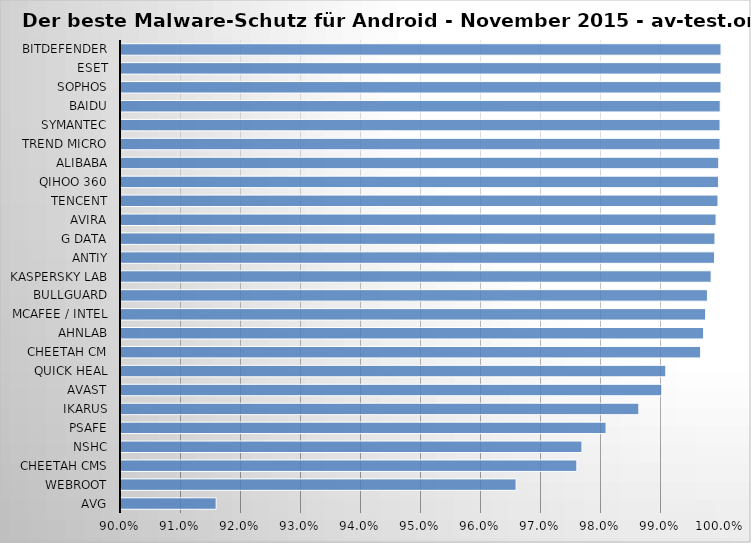
| Category | Series 0 |
|---|---|
| AVG | 0.916 |
| Webroot | 0.966 |
| Cheetah CMS | 0.976 |
| NSHC | 0.977 |
| PSafe | 0.981 |
| Ikarus | 0.986 |
| Avast | 0.99 |
| Quick Heal | 0.991 |
| Cheetah CM | 0.997 |
| Ahnlab | 0.997 |
| McAfee / Intel | 0.997 |
| BullGuard | 0.998 |
| Kaspersky Lab | 0.998 |
| Antiy | 0.999 |
| G Data | 0.999 |
| Avira | 0.999 |
| Tencent | 0.999 |
| Qihoo 360 | 1 |
| Alibaba | 1 |
| Trend Micro | 1 |
| Symantec | 1 |
| Baidu | 1 |
| Sophos | 1 |
| ESET | 1 |
| Bitdefender | 1 |